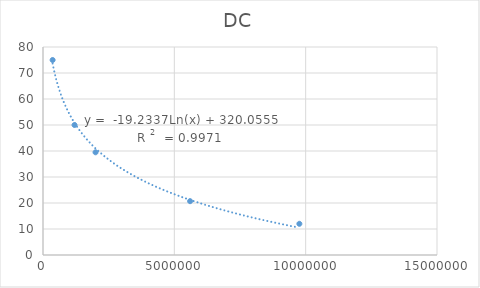
| Category | DC |
|---|---|
| 366000.0 | 75 |
| 1200000.0 | 50 |
| 2000000.0 | 39.5 |
| 5600000.0 | 20.7 |
| 9760000.0 | 12 |